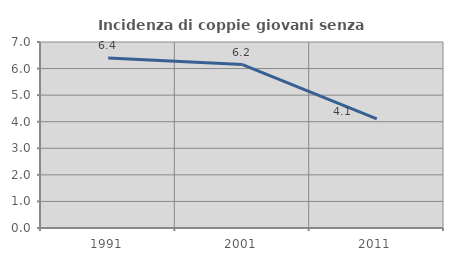
| Category | Incidenza di coppie giovani senza figli |
|---|---|
| 1991.0 | 6.402 |
| 2001.0 | 6.152 |
| 2011.0 | 4.104 |